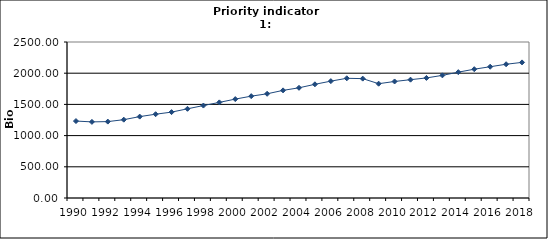
| Category | GDP, Bio Euro (EC95) |
|---|---|
| 1990 | 1233.195 |
| 1991 | 1219.779 |
| 1992 | 1224.304 |
| 1993 | 1255.235 |
| 1994 | 1304.126 |
| 1995 | 1342.881 |
| 1996 | 1376.34 |
| 1997 | 1429.395 |
| 1998 | 1481.494 |
| 1999 | 1532.284 |
| 2000 | 1584.955 |
| 2001 | 1632.098 |
| 2002 | 1670.033 |
| 2003 | 1724.917 |
| 2004 | 1765.866 |
| 2005 | 1822.015 |
| 2006 | 1872.819 |
| 2007 | 1918.339 |
| 2008 | 1912.945 |
| 2009 | 1831.687 |
| 2010 | 1867.396 |
| 2011 | 1896.157 |
| 2012 | 1924.199 |
| 2013 | 1965.367 |
| 2014 | 2016.614 |
| 2015 | 2064.116 |
| 2016 | 2103.709 |
| 2017 | 2143.512 |
| 2018 | 2173.214 |